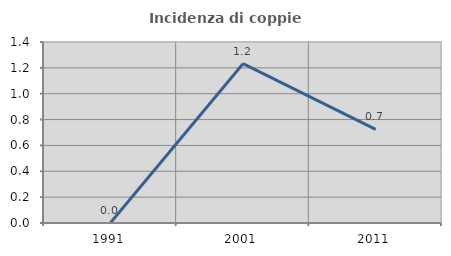
| Category | Incidenza di coppie miste |
|---|---|
| 1991.0 | 0 |
| 2001.0 | 1.232 |
| 2011.0 | 0.725 |